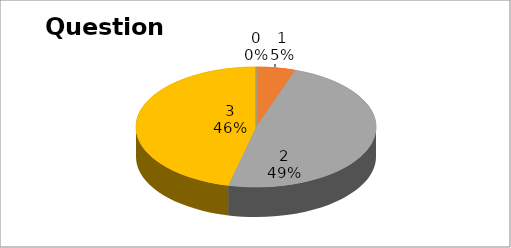
| Category | Series 0 |
|---|---|
| 0 | 0 |
| 1 | 5 |
| 2 | 46 |
| 3 | 44 |